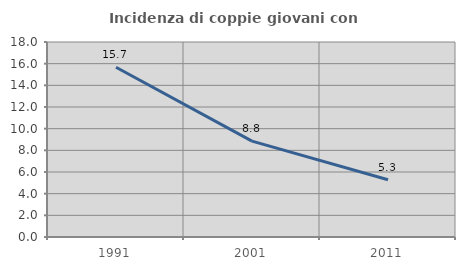
| Category | Incidenza di coppie giovani con figli |
|---|---|
| 1991.0 | 15.673 |
| 2001.0 | 8.845 |
| 2011.0 | 5.281 |